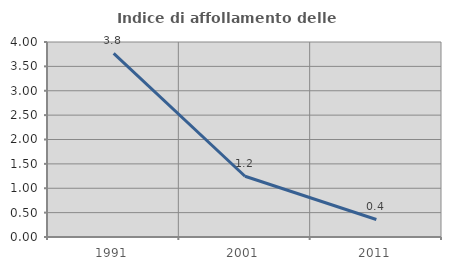
| Category | Indice di affollamento delle abitazioni  |
|---|---|
| 1991.0 | 3.765 |
| 2001.0 | 1.246 |
| 2011.0 | 0.359 |